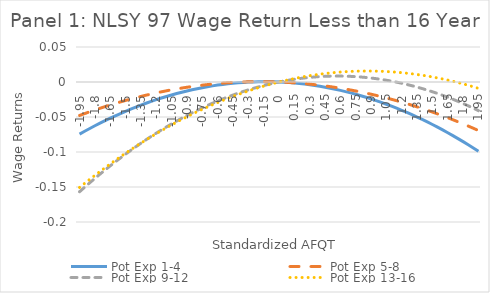
| Category | Pot Exp 1-4 | Pot Exp 5-8 | Pot Exp 9-12 | Pot Exp 13-16 |
|---|---|---|---|---|
| -1.95 | -0.074 | -0.048 | -0.157 | -0.151 |
| -1.9 | -0.07 | -0.045 | -0.15 | -0.145 |
| -1.8499999999999999 | -0.066 | -0.042 | -0.144 | -0.139 |
| -1.7999999999999998 | -0.063 | -0.04 | -0.138 | -0.133 |
| -1.7499999999999998 | -0.059 | -0.038 | -0.132 | -0.128 |
| -1.6999999999999997 | -0.055 | -0.035 | -0.126 | -0.122 |
| -1.6499999999999997 | -0.052 | -0.033 | -0.12 | -0.117 |
| -1.5999999999999996 | -0.048 | -0.031 | -0.114 | -0.112 |
| -1.5499999999999996 | -0.045 | -0.028 | -0.108 | -0.107 |
| -1.4999999999999996 | -0.042 | -0.026 | -0.103 | -0.102 |
| -1.4499999999999995 | -0.039 | -0.024 | -0.098 | -0.097 |
| -1.3999999999999995 | -0.036 | -0.022 | -0.093 | -0.092 |
| -1.3499999999999994 | -0.033 | -0.021 | -0.087 | -0.087 |
| -1.2999999999999994 | -0.03 | -0.019 | -0.083 | -0.083 |
| -1.2499999999999993 | -0.028 | -0.017 | -0.078 | -0.078 |
| -1.1999999999999993 | -0.025 | -0.016 | -0.073 | -0.074 |
| -1.1499999999999992 | -0.023 | -0.014 | -0.069 | -0.07 |
| -1.0999999999999992 | -0.021 | -0.013 | -0.064 | -0.065 |
| -1.0499999999999992 | -0.019 | -0.011 | -0.06 | -0.061 |
| -0.9999999999999991 | -0.016 | -0.01 | -0.056 | -0.057 |
| -0.9499999999999991 | -0.015 | -0.009 | -0.052 | -0.053 |
| -0.899999999999999 | -0.013 | -0.008 | -0.048 | -0.05 |
| -0.849999999999999 | -0.011 | -0.006 | -0.044 | -0.046 |
| -0.7999999999999989 | -0.01 | -0.005 | -0.04 | -0.042 |
| -0.7499999999999989 | -0.008 | -0.005 | -0.037 | -0.039 |
| -0.6999999999999988 | -0.007 | -0.004 | -0.034 | -0.036 |
| -0.6499999999999988 | -0.006 | -0.003 | -0.03 | -0.032 |
| -0.5999999999999988 | -0.004 | -0.002 | -0.027 | -0.029 |
| -0.5499999999999987 | -0.003 | -0.002 | -0.024 | -0.026 |
| -0.4999999999999987 | -0.003 | -0.001 | -0.021 | -0.023 |
| -0.44999999999999873 | -0.002 | -0.001 | -0.019 | -0.021 |
| -0.39999999999999875 | -0.001 | 0 | -0.016 | -0.018 |
| -0.34999999999999876 | -0.001 | 0 | -0.014 | -0.015 |
| -0.29999999999999877 | 0 | 0 | -0.011 | -0.013 |
| -0.24999999999999878 | 0 | 0 | -0.009 | -0.01 |
| -0.1999999999999988 | 0 | 0 | -0.007 | -0.008 |
| -0.1499999999999988 | 0 | 0 | -0.005 | -0.006 |
| -0.0999999999999988 | 0 | 0 | -0.003 | -0.004 |
| -0.049999999999998795 | 0 | 0 | -0.002 | -0.002 |
| 0.0 | 0 | 0 | 0 | 0 |
| 0.05 | 0 | 0 | 0.001 | 0.002 |
| 0.1 | -0.001 | -0.001 | 0.003 | 0.003 |
| 0.15000000000000002 | -0.001 | -0.001 | 0.004 | 0.005 |
| 0.2 | -0.002 | -0.002 | 0.005 | 0.006 |
| 0.25 | -0.003 | -0.002 | 0.006 | 0.008 |
| 0.3 | -0.004 | -0.003 | 0.007 | 0.009 |
| 0.35 | -0.005 | -0.004 | 0.007 | 0.01 |
| 0.39999999999999997 | -0.006 | -0.005 | 0.008 | 0.011 |
| 0.44999999999999996 | -0.007 | -0.006 | 0.008 | 0.012 |
| 0.49999999999999994 | -0.009 | -0.007 | 0.008 | 0.013 |
| 0.5499999999999999 | -0.01 | -0.008 | 0.008 | 0.014 |
| 0.6 | -0.012 | -0.009 | 0.008 | 0.014 |
| 0.65 | -0.014 | -0.01 | 0.008 | 0.015 |
| 0.7000000000000001 | -0.016 | -0.011 | 0.008 | 0.015 |
| 0.7500000000000001 | -0.018 | -0.013 | 0.008 | 0.015 |
| 0.8000000000000002 | -0.02 | -0.014 | 0.007 | 0.016 |
| 0.8500000000000002 | -0.022 | -0.016 | 0.006 | 0.016 |
| 0.9000000000000002 | -0.024 | -0.017 | 0.006 | 0.016 |
| 0.9500000000000003 | -0.027 | -0.019 | 0.005 | 0.016 |
| 1.0000000000000002 | -0.029 | -0.021 | 0.004 | 0.015 |
| 1.0500000000000003 | -0.032 | -0.023 | 0.003 | 0.015 |
| 1.1000000000000003 | -0.035 | -0.025 | 0.001 | 0.015 |
| 1.1500000000000004 | -0.037 | -0.027 | 0 | 0.014 |
| 1.2000000000000004 | -0.04 | -0.029 | -0.002 | 0.013 |
| 1.2500000000000004 | -0.044 | -0.031 | -0.004 | 0.013 |
| 1.3000000000000005 | -0.047 | -0.033 | -0.005 | 0.012 |
| 1.3500000000000005 | -0.05 | -0.036 | -0.007 | 0.011 |
| 1.4000000000000006 | -0.054 | -0.038 | -0.009 | 0.01 |
| 1.4500000000000006 | -0.057 | -0.04 | -0.012 | 0.008 |
| 1.5000000000000007 | -0.061 | -0.043 | -0.014 | 0.007 |
| 1.5500000000000007 | -0.065 | -0.046 | -0.016 | 0.006 |
| 1.6000000000000008 | -0.068 | -0.048 | -0.019 | 0.004 |
| 1.6500000000000008 | -0.072 | -0.051 | -0.022 | 0.003 |
| 1.7000000000000008 | -0.077 | -0.054 | -0.025 | 0.001 |
| 1.7500000000000009 | -0.081 | -0.057 | -0.028 | -0.001 |
| 1.800000000000001 | -0.085 | -0.06 | -0.031 | -0.003 |
| 1.850000000000001 | -0.09 | -0.063 | -0.034 | -0.005 |
| 1.900000000000001 | -0.094 | -0.066 | -0.037 | -0.007 |
| 1.950000000000001 | -0.099 | -0.069 | -0.041 | -0.009 |